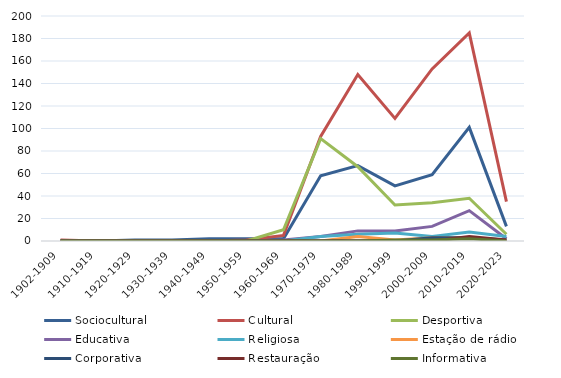
| Category | Sociocultural | Cultural | Desportiva | Educativa | Religiosa | Estação de rádio | Corporativa | Restauração | Informativa |
|---|---|---|---|---|---|---|---|---|---|
| 1902-1909 | 0 | 1 | 0 | 0 | 0 | 0 | 0 | 0 | 0 |
| 1910-1919 | 0 | 0 | 0 | 0 | 0 | 0 | 0 | 0 | 0 |
| 1920-1929 | 1 | 0 | 0 | 0 | 0 | 0 | 0 | 0 | 0 |
| 1930-1939 | 1 | 0 | 0 | 0 | 0 | 0 | 0 | 0 | 0 |
| 1940-1949 | 2 | 0 | 0 | 0 | 0 | 0 | 0 | 0 | 0 |
| 1950-1959 | 2 | 1 | 0 | 0 | 0 | 0 | 0 | 0 | 0 |
| 1960-1969 | 2 | 5 | 10 | 1 | 0 | 0 | 0 | 0 | 0 |
| 1970-1979 | 58 | 93 | 91 | 4 | 4 | 0 | 0 | 0 | 0 |
| 1980-1989 | 67 | 148 | 66 | 9 | 6 | 4 | 0 | 0 | 0 |
| 1990-1999 | 49 | 109 | 32 | 9 | 7 | 1 | 0 | 0 | 1 |
| 2000-2009 | 59 | 153 | 34 | 13 | 4 | 3 | 3 | 0 | 1 |
| 2010-2019 | 101 | 185 | 38 | 27 | 8 | 3 | 3 | 4 | 2 |
| 2020-2023 | 13 | 35 | 6 | 2 | 4 | 0 | 1 | 1 | 0 |